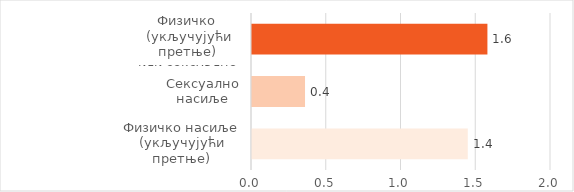
| Category | Series 0 |
|---|---|
| Физичко насиље (укључујући претње) | 1.443 |
| Сексуално насиље | 0.355 |
| Физичко  (укључујући претње) 
или сексуално насиље | 1.575 |